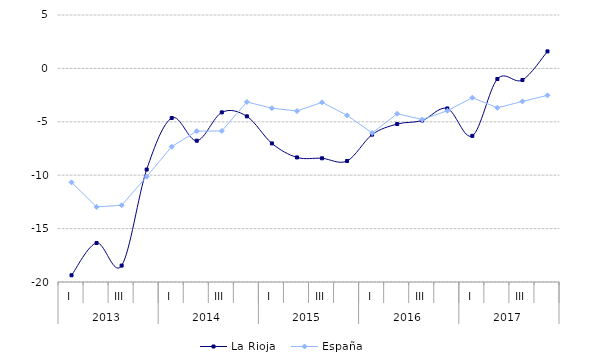
| Category | La Rioja  | España |
|---|---|---|
| 0 | -19.37 | -10.67 |
| 1 | -16.346 | -12.968 |
| 2 | -18.463 | -12.818 |
| 3 | -9.468 | -10.133 |
| 4 | -4.643 | -7.325 |
| 5 | -6.77 | -5.874 |
| 6 | -4.118 | -5.856 |
| 7 | -4.488 | -3.14 |
| 8 | -7.026 | -3.728 |
| 9 | -8.335 | -3.991 |
| 10 | -8.417 | -3.177 |
| 11 | -8.668 | -4.395 |
| 12 | -6.202 | -6.047 |
| 13 | -5.21 | -4.247 |
| 14 | -4.874 | -4.787 |
| 15 | -3.75 | -3.967 |
| 16 | -6.315 | -2.742 |
| 17 | -0.994 | -3.688 |
| 18 | -1.085 | -3.091 |
| 19 | 1.593 | -2.522 |